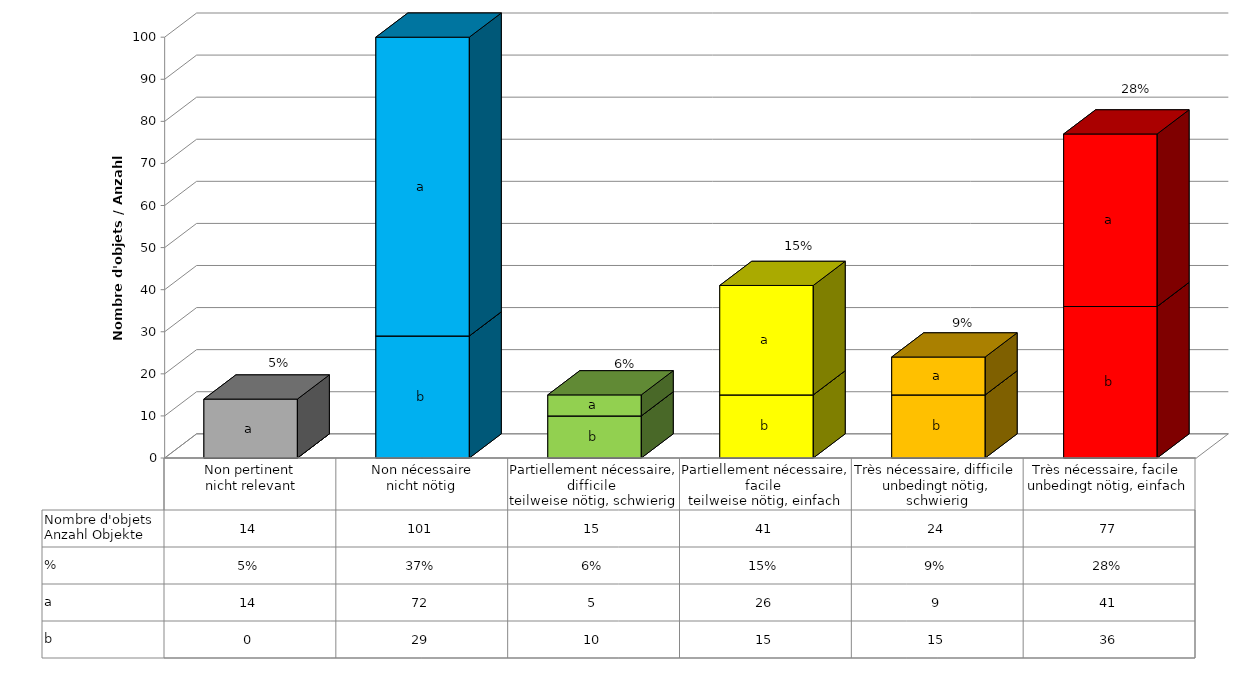
| Category | b | a | % | Nombre d'objets
Anzahl Objekte |
|---|---|---|---|---|
| Non pertinent
 nicht relevant | 0 | 14 | 0.051 | 14 |
| Non nécessaire
nicht nötig | 29 | 72 | 0.371 | 101 |
| Partiellement nécessaire, difficile 
teilweise nötig, schwierig | 10 | 5 | 0.055 | 15 |
| Partiellement nécessaire, facile 
teilweise nötig, einfach | 15 | 26 | 0.151 | 41 |
| Très nécessaire, difficile 
unbedingt nötig, schwierig | 15 | 9 | 0.088 | 24 |
| Très nécessaire, facile 
unbedingt nötig, einfach | 36 | 41 | 0.283 | 77 |